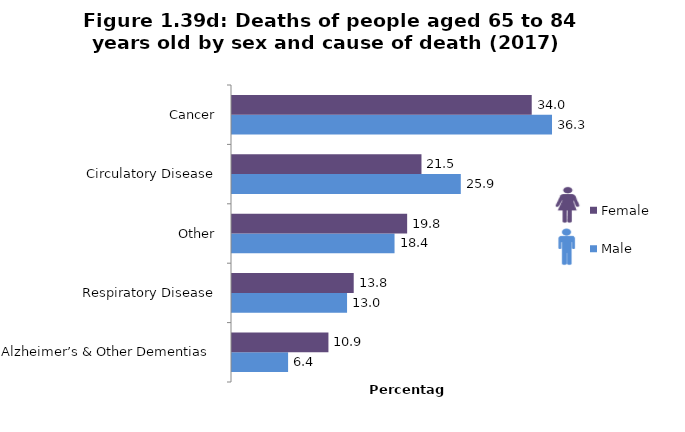
| Category | Male | Female |
|---|---|---|
| Alzheimer’s & Other Dementias  | 6.356 | 10.927 |
| Respiratory Disease | 13.038 | 13.792 |
| Other | 18.418 | 19.846 |
| Circulatory Disease | 25.926 | 21.471 |
| Cancer | 36.261 | 33.963 |